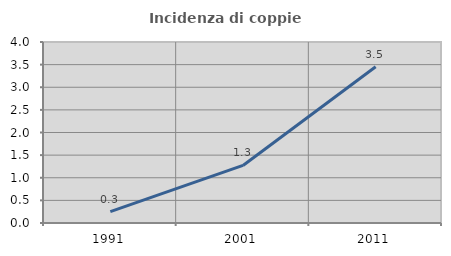
| Category | Incidenza di coppie miste |
|---|---|
| 1991.0 | 0.251 |
| 2001.0 | 1.272 |
| 2011.0 | 3.455 |